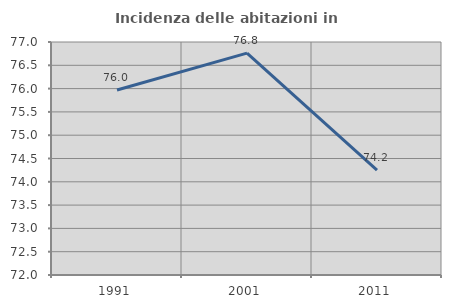
| Category | Incidenza delle abitazioni in proprietà  |
|---|---|
| 1991.0 | 75.97 |
| 2001.0 | 76.762 |
| 2011.0 | 74.249 |